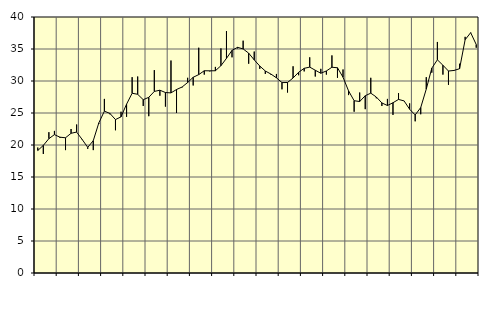
| Category | Piggar | Series 1 |
|---|---|---|
| nan | 19.6 | 19.14 |
| 1.0 | 18.6 | 19.94 |
| 1.0 | 22 | 20.99 |
| 1.0 | 22.2 | 21.62 |
| nan | 21.1 | 21.22 |
| 2.0 | 19.2 | 21.13 |
| 2.0 | 22.5 | 21.83 |
| 2.0 | 23.2 | 22.02 |
| nan | 20.8 | 20.86 |
| 3.0 | 19.4 | 19.63 |
| 3.0 | 19.2 | 20.68 |
| 3.0 | 23.3 | 23.45 |
| nan | 27.2 | 25.29 |
| 4.0 | 24.8 | 24.93 |
| 4.0 | 22.3 | 23.97 |
| 4.0 | 25.2 | 24.4 |
| nan | 24.4 | 26.38 |
| 5.0 | 30.6 | 28.09 |
| 5.0 | 30.7 | 27.92 |
| 5.0 | 26.1 | 27.08 |
| nan | 24.5 | 27.45 |
| 6.0 | 31.7 | 28.37 |
| 6.0 | 27.7 | 28.56 |
| 6.0 | 26 | 28.2 |
| nan | 33.2 | 28.14 |
| 7.0 | 25 | 28.67 |
| 7.0 | 29 | 29.06 |
| 7.0 | 30.5 | 29.76 |
| nan | 29.3 | 30.58 |
| 8.0 | 35.2 | 31 |
| 8.0 | 31 | 31.6 |
| 8.0 | 31.5 | 31.59 |
| nan | 32.2 | 31.6 |
| 9.0 | 35.1 | 32.39 |
| 9.0 | 37.8 | 33.54 |
| 9.0 | 33.7 | 34.79 |
| nan | 35.1 | 35.26 |
| 10.0 | 36.3 | 35.01 |
| 10.0 | 32.7 | 34.35 |
| 10.0 | 34.6 | 33.3 |
| nan | 31.9 | 32.34 |
| 11.0 | 31.1 | 31.56 |
| 11.0 | 31 | 31.09 |
| 11.0 | 31.1 | 30.5 |
| nan | 28.7 | 29.75 |
| 12.0 | 28.2 | 29.77 |
| 12.0 | 32.3 | 30.47 |
| 12.0 | 30.9 | 31.36 |
| nan | 31.5 | 31.98 |
| 13.0 | 33.7 | 32.17 |
| 13.0 | 30.7 | 31.68 |
| 13.0 | 31.9 | 31.21 |
| nan | 31 | 31.57 |
| 14.0 | 34 | 32.15 |
| 14.0 | 30.5 | 32.07 |
| 14.0 | 31.8 | 30.59 |
| nan | 27.8 | 28.45 |
| 15.0 | 25.2 | 26.92 |
| 15.0 | 28.2 | 26.79 |
| 15.0 | 25.6 | 27.7 |
| nan | 30.5 | 28.1 |
| 16.0 | 27.3 | 27.5 |
| 16.0 | 26.1 | 26.57 |
| 16.0 | 27.2 | 26.17 |
| nan | 24.7 | 26.6 |
| 17.0 | 28.1 | 27.12 |
| 17.0 | 26.9 | 26.89 |
| 17.0 | 26.5 | 25.59 |
| nan | 23.7 | 24.69 |
| 18.0 | 24.8 | 25.85 |
| 18.0 | 30.6 | 28.74 |
| 18.0 | 31.3 | 32.01 |
| nan | 36.1 | 33.31 |
| 19.0 | 31 | 32.46 |
| 19.0 | 29.4 | 31.56 |
| 19.0 | 31.7 | 31.65 |
| nan | 32.7 | 31.92 |
| 20.0 | 36.9 | 36.45 |
| 20.0 | 37.5 | 37.55 |
| 20.0 | 35.2 | 35.7 |